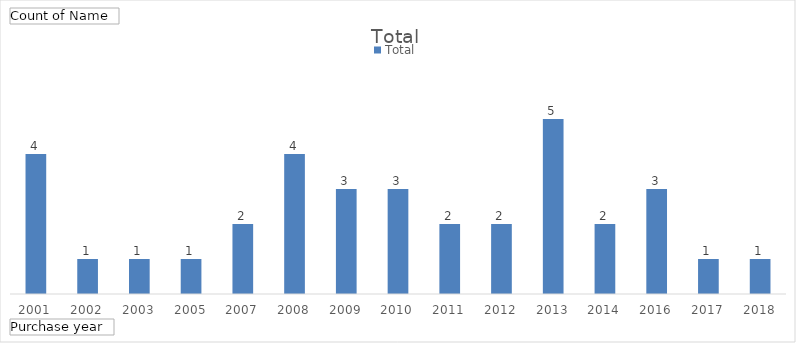
| Category | Total |
|---|---|
| 2001 | 4 |
| 2002 | 1 |
| 2003 | 1 |
| 2005 | 1 |
| 2007 | 2 |
| 2008 | 4 |
| 2009 | 3 |
| 2010 | 3 |
| 2011 | 2 |
| 2012 | 2 |
| 2013 | 5 |
| 2014 | 2 |
| 2016 | 3 |
| 2017 | 1 |
| 2018 | 1 |